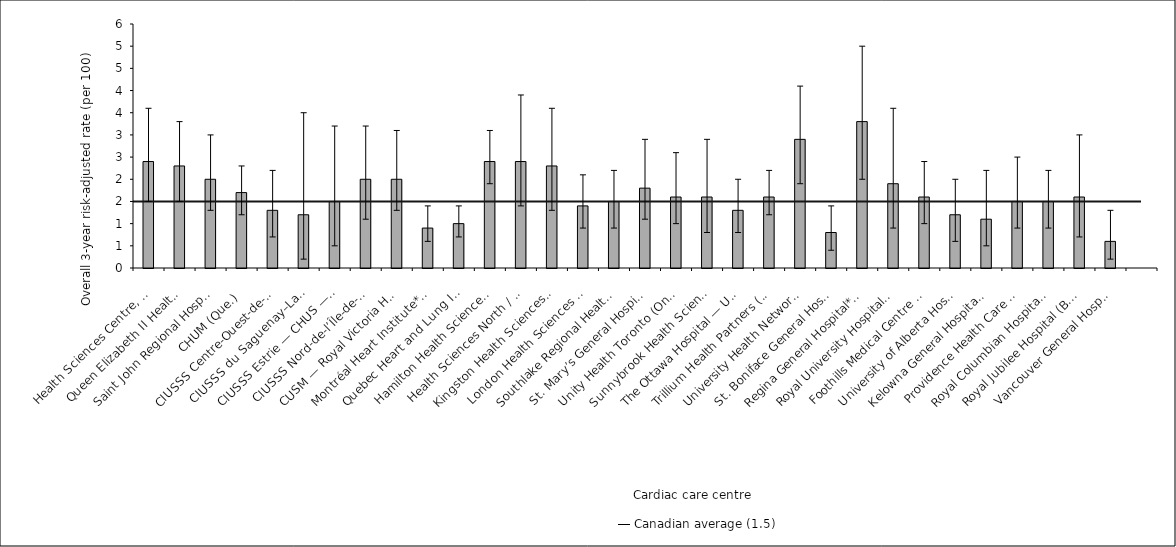
| Category | Risk-adjusted rate |
|---|---|
| Health Sciences Centre, St. John’s (N.L.) | 2.4 |
| Queen Elizabeth II Health Sciences Centre (N.S.) | 2.3 |
| Saint John Regional Hospital (N.B.) | 2 |
| CHUM (Que.) | 1.7 |
| CIUSSS Centre-Ouest-de-l’Île-de-Montréal — Jewish General Hospital (Que.) | 1.3 |
| CIUSSS du Saguenay–Lac-St-Jean — Chicoutimi Hospital (Que.) | 1.2 |
| CIUSSS Estrie — CHUS — Fleurimont Hospital (Que.) | 1.5 |
| CIUSSS Nord-de-l’Île-de-Montréal — Montréal Sacré-Coeur Hospital (Que.) | 2 |
| CUSM — Royal Victoria Hospital (Que.) | 2 |
| Montréal Heart Institute* (Que.) | 0.9 |
| Quebec Heart and Lung Institute* (Que.) | 1 |
| Hamilton Health Sciences* (Ont.) | 2.4 |
| Health Sciences North / Horizon Santé-Nord (Ont.) | 2.4 |
| Kingston Health Sciences Centre (Ont.) | 2.3 |
| London Health Sciences Centre (Ont.) | 1.4 |
| Southlake Regional Health Centre (Ont.) | 1.5 |
| St. Mary’s General Hospital (Ont.) | 1.8 |
| Unity Health Toronto (Ont.) | 1.6 |
| Sunnybrook Health Sciences Centre (Ont.) | 1.6 |
| The Ottawa Hospital — University of Ottawa Heart Institute (Ont.) | 1.3 |
| Trillium Health Partners (Ont.) | 1.6 |
| University Health Network* (Ont.) | 2.9 |
| St. Boniface General Hospital* (Man.) | 0.8 |
| Regina General Hospital* (Sask.) | 3.3 |
| Royal University Hospital (Sask.) | 1.9 |
| Foothills Medical Centre (Alta.) | 1.6 |
| University of Alberta Hospital (Alta.) | 1.2 |
| Kelowna General Hospital (B.C.) | 1.1 |
| Providence Health Care — St. Paul’s Hospital (Vancouver) (B.C.) | 1.5 |
| Royal Columbian Hospital (B.C.) | 1.5 |
| Royal Jubilee Hospital (B.C.) | 1.6 |
| Vancouver General Hospital* (B.C.) | 0.6 |